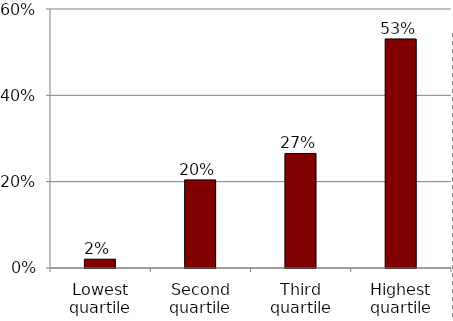
| Category | Series 0 |
|---|---|
| Lowest quartile | 0.02 |
| Second quartile | 0.204 |
| Third quartile | 0.265 |
| Highest quartile | 0.531 |